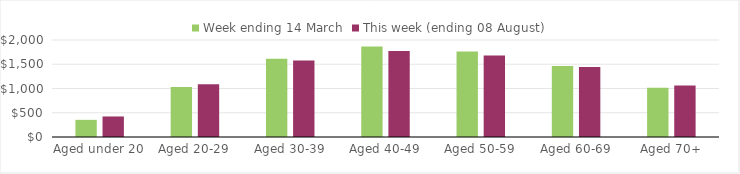
| Category | Week ending 14 March | This week (ending 08 August) |
|---|---|---|
| Aged under 20 | 353.75 | 423.58 |
| Aged 20-29 | 1032.24 | 1088.84 |
| Aged 30-39 | 1611.97 | 1577.18 |
| Aged 40-49 | 1865.74 | 1772.74 |
| Aged 50-59 | 1760.58 | 1679.71 |
| Aged 60-69 | 1466.43 | 1441.77 |
| Aged 70+ | 1017.86 | 1061.1 |